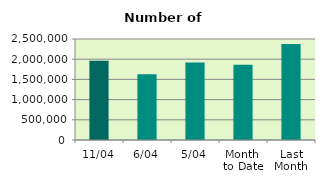
| Category | Series 0 |
|---|---|
| 11/04 | 1962766 |
| 6/04 | 1627374 |
| 5/04 | 1920258 |
| Month 
to Date | 1863923.6 |
| Last
Month | 2375448 |